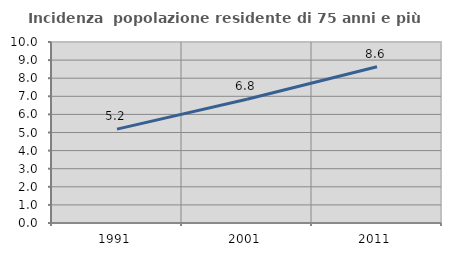
| Category | Incidenza  popolazione residente di 75 anni e più |
|---|---|
| 1991.0 | 5.187 |
| 2001.0 | 6.834 |
| 2011.0 | 8.629 |